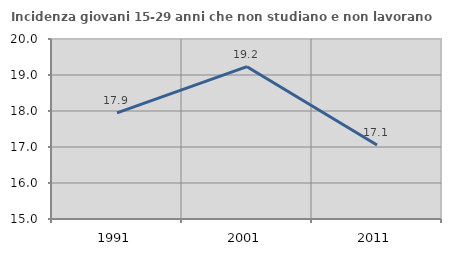
| Category | Incidenza giovani 15-29 anni che non studiano e non lavorano  |
|---|---|
| 1991.0 | 17.949 |
| 2001.0 | 19.231 |
| 2011.0 | 17.054 |